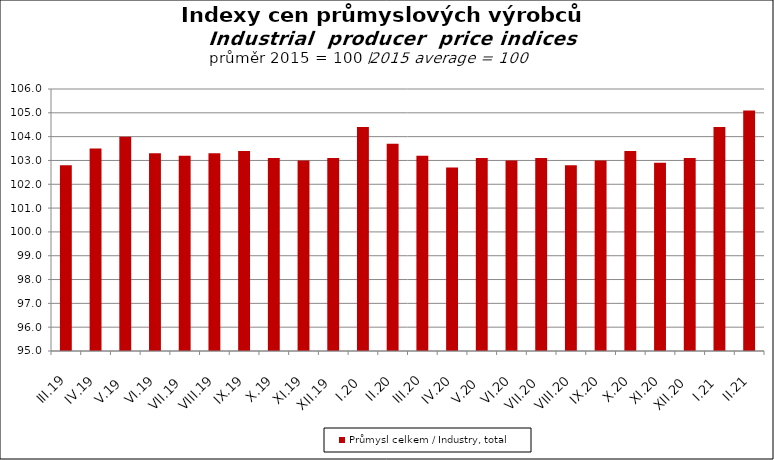
| Category | Průmysl celkem / Industry, total |
|---|---|
| III.19 | 102.8 |
| IV.19 | 103.5 |
| V.19 | 104 |
| VI.19 | 103.3 |
| VII.19 | 103.2 |
| VIII.19 | 103.3 |
| IX.19 | 103.4 |
| X.19 | 103.1 |
| XI.19 | 103 |
| XII.19 | 103.1 |
| I.20 | 104.4 |
| II.20 | 103.7 |
| III.20 | 103.2 |
| IV.20 | 102.7 |
| V.20 | 103.1 |
| VI.20 | 103 |
| VII.20 | 103.1 |
| VIII.20 | 102.8 |
| IX.20 | 103 |
| X.20 | 103.4 |
| XI.20 | 102.9 |
| XII.20 | 103.1 |
| I.21 | 104.4 |
| II.21 | 105.1 |